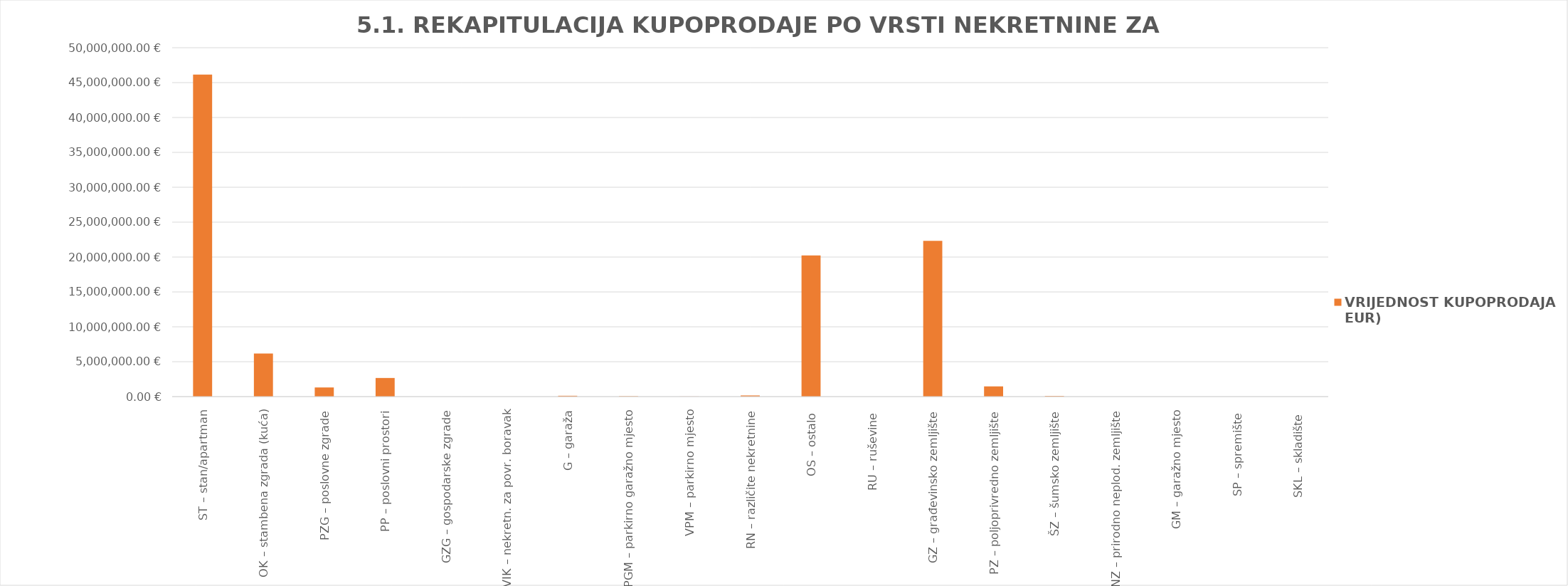
| Category | VRIJEDNOST KUPOPRODAJA (u EUR) |
|---|---|
| ST – stan/apartman | 46142675.973 |
| OK – stambena zgrada (kuća) | 6175400 |
| PZG – poslovne zgrade | 1310000 |
| PP – poslovni prostori | 2668352.501 |
| GZG – gospodarske zgrade | 0 |
| VIK – nekretn. za povr. boravak | 0 |
| G – garaža | 119500 |
| PGM – parkirno garažno mjesto | 53429.441 |
| VPM – parkirno mjesto | 12500 |
| RN – različite nekretnine | 162500 |
| OS – ostalo  | 20234217.726 |
| RU – ruševine  | 0 |
| GZ – građevinsko zemljište | 22325934.034 |
| PZ – poljoprivredno zemljište | 1462664.713 |
| ŠZ – šumsko zemljište | 88125 |
| PNZ – prirodno neplod. zemljište | 0 |
| GM – garažno mjesto | 0 |
| SP – spremište  | 0 |
| SKL – skladište  | 0 |